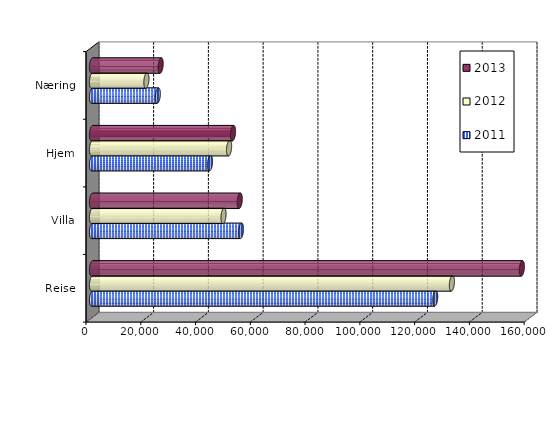
| Category | 2011 | 2012 | 2013 |
|---|---|---|---|
| Reise | 125331.394 | 131420 | 156964 |
| Villa | 54404.891 | 48038 | 53950 |
| Hjem | 43081.731 | 50056 | 51497 |
| Næring | 24024.954 | 19866 | 25068 |